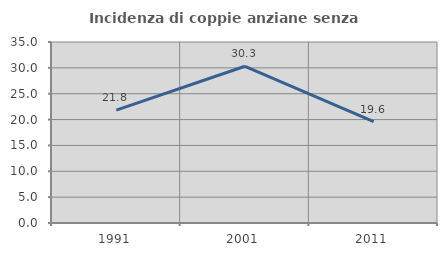
| Category | Incidenza di coppie anziane senza figli  |
|---|---|
| 1991.0 | 21.831 |
| 2001.0 | 30.303 |
| 2011.0 | 19.588 |